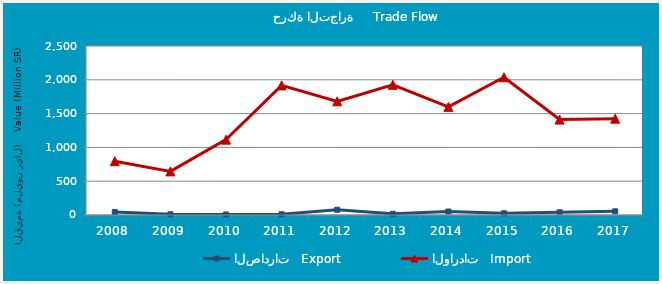
| Category | الصادرات   Export | الواردات   Import |
|---|---|---|
| 2008.0 | 45355575 | 795704188 |
| 2009.0 | 11406058 | 645138349 |
| 2010.0 | 7736738 | 1114765362 |
| 2011.0 | 11279436 | 1917271362 |
| 2012.0 | 77708787 | 1681256522 |
| 2013.0 | 17900142 | 1926128741 |
| 2014.0 | 51649153 | 1599485303 |
| 2015.0 | 25776661 | 2037593976 |
| 2016.0 | 40599260 | 1411758155 |
| 2017.0 | 54161610 | 1424375796 |